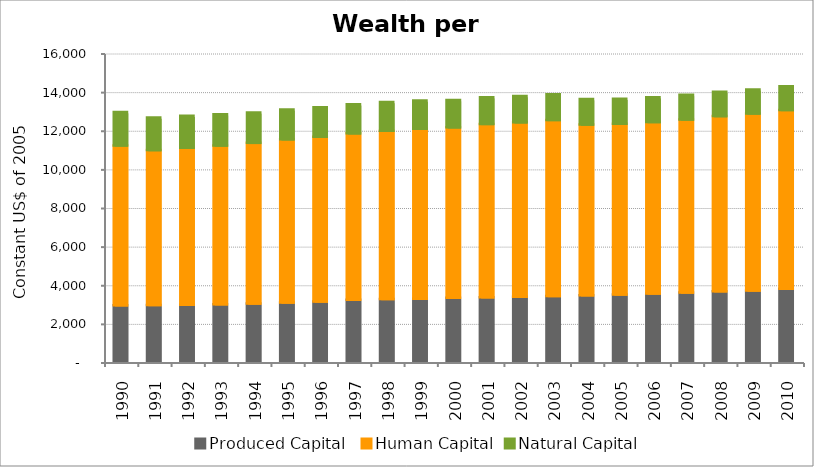
| Category | Produced Capital  | Human Capital | Natural Capital |
|---|---|---|---|
| 1990.0 | 2929.495 | 8274.364 | 1723.937 |
| 1991.0 | 2936.912 | 8022.95 | 1688.077 |
| 1992.0 | 2953.204 | 8133.756 | 1650.21 |
| 1993.0 | 2982.326 | 8216.456 | 1613.568 |
| 1994.0 | 3021.209 | 8312.9 | 1578.277 |
| 1995.0 | 3063.423 | 8456.635 | 1546.965 |
| 1996.0 | 3125.24 | 8531.14 | 1521.776 |
| 1997.0 | 3206.447 | 8621.789 | 1505.185 |
| 1998.0 | 3247.723 | 8713.519 | 1490.045 |
| 1999.0 | 3268.58 | 8799.834 | 1459.063 |
| 2000.0 | 3308.949 | 8828.597 | 1413.031 |
| 2001.0 | 3336.298 | 8980.778 | 1384.066 |
| 2002.0 | 3364.781 | 9032.918 | 1358.672 |
| 2003.0 | 3403.266 | 9117.833 | 1336.006 |
| 2004.0 | 3441.943 | 8839.203 | 1321.603 |
| 2005.0 | 3481.87 | 8842.818 | 1299.494 |
| 2006.0 | 3530.516 | 8882.212 | 1285.448 |
| 2007.0 | 3587.19 | 8960.582 | 1271.962 |
| 2008.0 | 3645.888 | 9073.027 | 1259.221 |
| 2009.0 | 3693.096 | 9163.56 | 1246.093 |
| 2010.0 | 3780.517 | 9256.616 | 1227.905 |